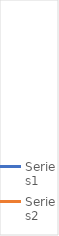
| Category | Series 0 | Series 1 |
|---|---|---|
| 0 | 78.7 |  |
| 1 | 86.2 |  |
| 2 | 95.4 |  |
| 3 | 93 |  |
| 4 | 91.2 |  |
| 5 | 91.5 |  |
| 6 | 98.5 |  |